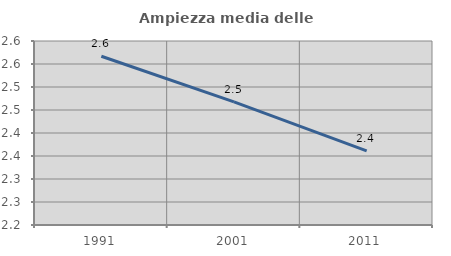
| Category | Ampiezza media delle famiglie |
|---|---|
| 1991.0 | 2.567 |
| 2001.0 | 2.468 |
| 2011.0 | 2.361 |